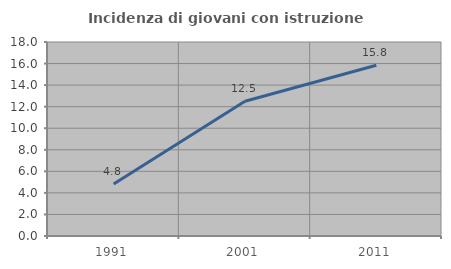
| Category | Incidenza di giovani con istruzione universitaria |
|---|---|
| 1991.0 | 4.833 |
| 2001.0 | 12.5 |
| 2011.0 | 15.849 |